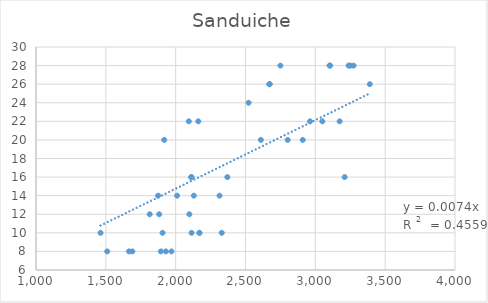
| Category | Sanduiche |
|---|---|
| 1894.0 | 8 |
| 2802.0 | 20 |
| 2750.0 | 28 |
| 2110.0 | 16 |
| 1970.0 | 8 |
| 2098.0 | 12 |
| 1930.0 | 8 |
| 2130.0 | 14 |
| 2330.0 | 10 |
| 2010.0 | 14 |
| 2674.0 | 26 |
| 2370.0 | 16 |
| 1906.0 | 10 |
| 2114.0 | 16 |
| 2910.0 | 20 |
| 1510.0 | 8 |
| 1874.0 | 14 |
| 2094.0 | 22 |
| 2670.0 | 26 |
| 3390.0 | 26 |
| 1882.0 | 12 |
| 3050.0 | 22 |
| 3174.0 | 22 |
| 2114.0 | 10 |
| 1690.0 | 8 |
| 1918.0 | 20 |
| 3238.0 | 28 |
| 1814.0 | 12 |
| 2610.0 | 20 |
| 1462.0 | 10 |
| 3106.0 | 28 |
| 2522.0 | 24 |
| 1666.0 | 8 |
| 3274.0 | 28 |
| 3102.0 | 28 |
| 3210.0 | 16 |
| 2170.0 | 10 |
| 2962.0 | 22 |
| 2170.0 | 10 |
| 3250.0 | 28 |
| 2314.0 | 14 |
| 2162.0 | 22 |